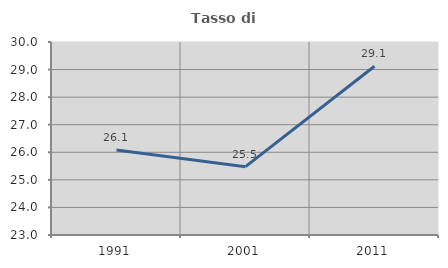
| Category | Tasso di occupazione   |
|---|---|
| 1991.0 | 26.082 |
| 2001.0 | 25.478 |
| 2011.0 | 29.119 |